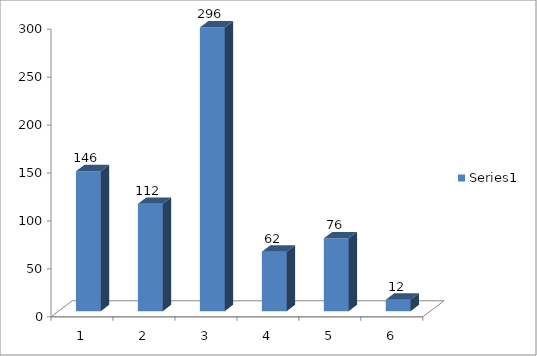
| Category | Series 0 |
|---|---|
| 0 | 146 |
| 1 | 112 |
| 2 | 296 |
| 3 | 62 |
| 4 | 76 |
| 5 | 12 |